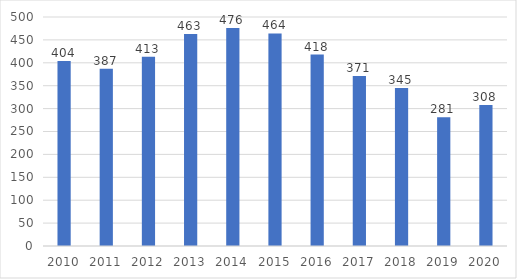
| Category | 0 a 14 anos |
|---|---|
| 2010 | 404 |
| 2011 | 387 |
| 2012 | 413 |
| 2013 | 463 |
| 2014 | 476 |
| 2015 | 464 |
| 2016 | 418 |
| 2017 | 371 |
| 2018 | 345 |
| 2019 | 281 |
| 2020 | 308 |